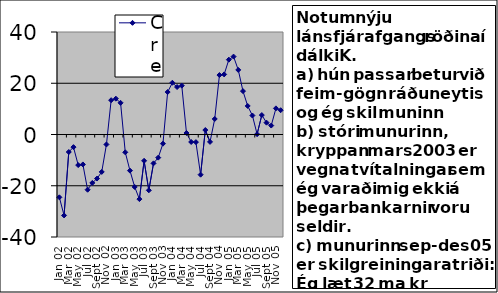
| Category | Credit balance | Series 1 |
|---|---|---|
| 2002-01-14 18:00:00 | -24.52 |  |
| 2002-02-14 04:30:00 | -31.58 |  |
| 2002-03-16 15:00:00 | -6.83 |  |
| 2002-04-16 01:30:00 | -4.93 |  |
| 2002-05-16 12:00:00 | -11.93 |  |
| 2002-06-15 22:30:00 | -11.68 |  |
| 2002-07-16 09:00:00 | -21.55 |  |
| 2002-08-15 19:30:00 | -18.9 |  |
| 2002-09-15 06:00:00 | -17.19 |  |
| 2002-10-15 16:30:00 | -14.6 |  |
| 2002-11-15 03:00:00 | -3.89 |  |
| 2002-12-15 13:30:00 | 13.39 |  |
| 2003-01-15 | 13.99 |  |
| 2003-02-14 10:30:00 | 12.36 |  |
| 2003-03-16 21:00:00 | -6.95 |  |
| 2003-04-16 19:30:00 | -14.1 |  |
| 2003-05-17 06:00:00 | -20.48 |  |
| 2003-06-16 16:30:00 | -25.21 |  |
| 2003-07-17 03:00:00 | -10.26 |  |
| 2003-08-17 | -21.78 |  |
| 2003-09-17 | -11.26 |  |
| 2003-10-17 | -9.03 |  |
| 2003-11-17 | -3.58 |  |
| 2003-12-17 | 16.57 |  |
| 2004-01-17 | 20.19 |  |
| 2004-02-17 | 18.53 |  |
| 2004-03-17 | 19.07 |  |
| 2004-04-17 | 0.59 |  |
| 2004-05-17 | -2.92 |  |
| 2004-06-17 | -2.97 |  |
| 2004-07-17 | -15.68 |  |
| 2004-08-17 | 1.74 |  |
| 2004-09-17 | -2.88 |  |
| 2004-10-17 | 6.06 |  |
| 2004-11-17 | 23.2 |  |
| 2004-12-17 | 23.45 |  |
| 2005-01-17 | 29.21 |  |
| 2005-02-17 | 30.4 |  |
| 2005-03-17 | 25.2 |  |
| 2005-04-17 | 16.93 |  |
| 2005-05-17 | 11.14 |  |
| 2005-06-17 | 7.41 |  |
| 2005-07-17 | 0.13 |  |
| 2005-08-17 | 7.58 |  |
| 2005-09-17 | 4.62 |  |
| 2005-10-17 | 3.49 |  |
| 2005-11-17 | 10.2 |  |
| 2005-12-17 | 9.48 |  |